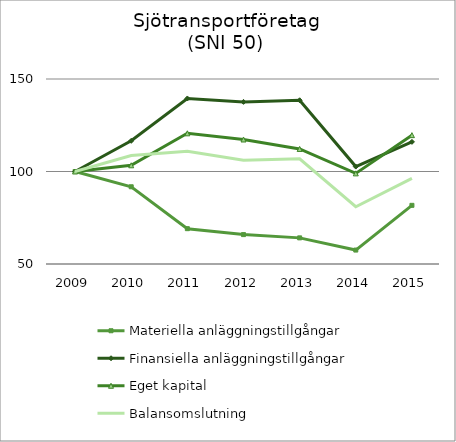
| Category | Materiella anläggningstillgångar | Finansiella anläggningstillgångar | Eget kapital | Balansomslutning |
|---|---|---|---|---|
| 2009.0 | 100 | 100 | 100 | 100 |
| 2010.0 | 91.748 | 116.593 | 103.355 | 108.657 |
| 2011.0 | 69.088 | 139.474 | 120.641 | 110.941 |
| 2012.0 | 65.891 | 137.635 | 117.299 | 106.092 |
| 2013.0 | 64.123 | 138.502 | 112.181 | 106.855 |
| 2014.0 | 57.527 | 102.66 | 98.99 | 80.942 |
| 2015.0 | 81.714 | 116.019 | 119.653 | 96.299 |